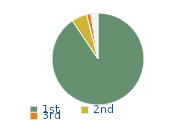
| Category | Series 0 |
|---|---|
| 1st | 90.6 |
| 2nd | 5.4 |
| 3rd | 1.5 |